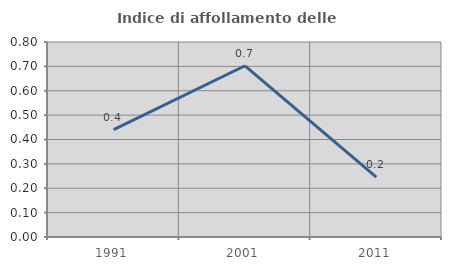
| Category | Indice di affollamento delle abitazioni  |
|---|---|
| 1991.0 | 0.44 |
| 2001.0 | 0.702 |
| 2011.0 | 0.246 |